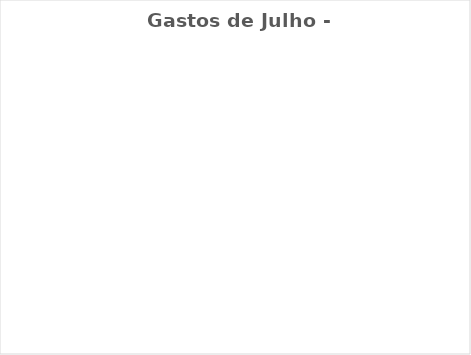
| Category | Gastos de Julho - Real |
|---|---|
| Despesas Mensais | 0 |
| Aposentadoria/Pagar à si | 0 |
| Gratidão/ Doação/ Dizimo | 0 |
| Desejos | 0 |
| Dívidas/Investimentos | 0 |